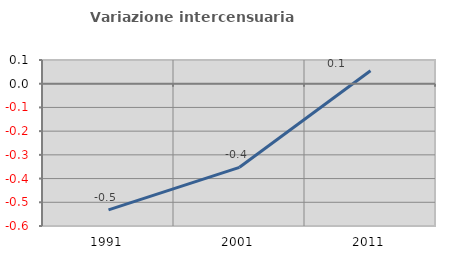
| Category | Variazione intercensuaria annua |
|---|---|
| 1991.0 | -0.532 |
| 2001.0 | -0.353 |
| 2011.0 | 0.055 |